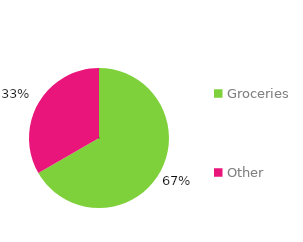
| Category | Item |
|---|---|
| Groceries | 40 |
| Other | 20 |